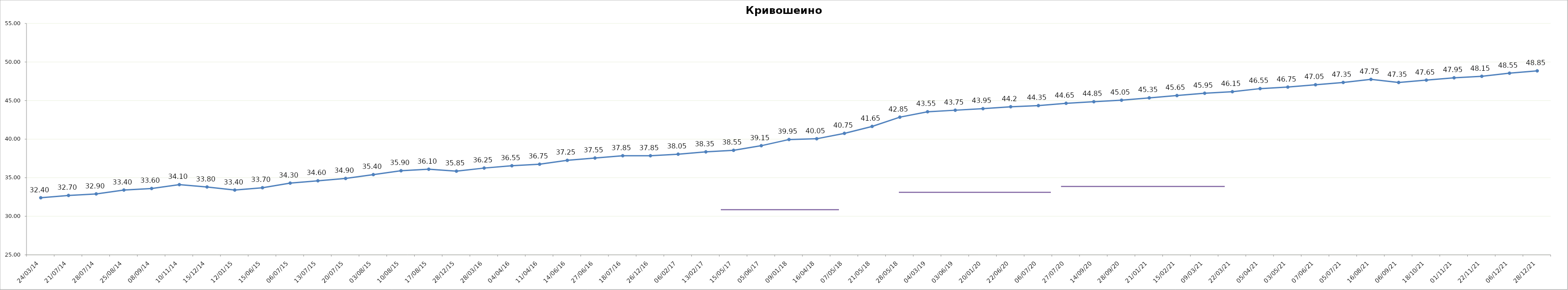
| Category | Series 0 |
|---|---|
| 2014-03-24 | 32.4 |
| 2014-07-21 | 32.7 |
| 2014-07-28 | 32.9 |
| 2014-08-25 | 33.4 |
| 2014-09-08 | 33.6 |
| 2014-11-10 | 34.1 |
| 2014-12-15 | 33.8 |
| 2015-01-12 | 33.4 |
| 2015-06-15 | 33.7 |
| 2015-07-06 | 34.3 |
| 2015-07-13 | 34.6 |
| 2015-07-20 | 34.9 |
| 2015-08-03 | 35.4 |
| 2015-08-10 | 35.9 |
| 2015-08-17 | 36.1 |
| 2015-12-28 | 35.85 |
| 2016-03-28 | 36.25 |
| 2016-04-04 | 36.55 |
| 2016-04-11 | 36.75 |
| 2016-06-14 | 37.25 |
| 2016-06-27 | 37.55 |
| 2016-07-18 | 37.85 |
| 2016-12-26 | 37.85 |
| 2017-02-06 | 38.05 |
| 2017-02-13 | 38.35 |
| 2017-05-15 | 38.55 |
| 2017-06-05 | 39.15 |
| 2018-01-09 | 39.95 |
| 2018-04-16 | 40.05 |
| 2018-05-07 | 40.75 |
| 2018-05-21 | 41.65 |
| 2018-05-28 | 42.85 |
| 2019-03-04 | 43.55 |
| 2019-06-03 | 43.75 |
| 2020-01-20 | 43.95 |
| 2020-06-22 | 44.2 |
| 2020-07-06 | 44.35 |
| 2020-07-27 | 44.65 |
| 2020-09-14 | 44.85 |
| 2020-09-28 | 45.05 |
| 2021-01-21 | 45.35 |
| 2021-02-15 | 45.65 |
| 2021-03-09 | 45.95 |
| 2021-03-22 | 46.15 |
| 2021-04-05 | 46.55 |
| 2021-05-03 | 46.75 |
| 2021-06-07 | 47.05 |
| 2021-07-05 | 47.35 |
| 2021-08-16 | 47.75 |
| 2021-09-06 | 47.35 |
| 2021-10-18 | 47.65 |
| 2021-11-01 | 47.95 |
| 2021-11-22 | 48.15 |
| 2021-12-06 | 48.55 |
| 2021-12-28 | 48.85 |